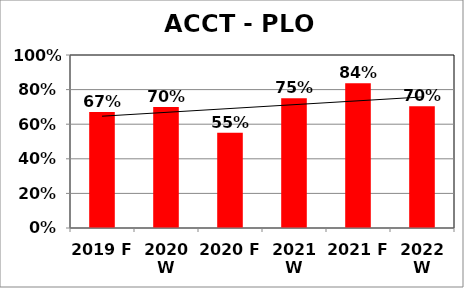
| Category | Series 0 |
|---|---|
| 2019 F | 0.67 |
| 2020 W | 0.7 |
| 2020 F | 0.55 |
| 2021 W | 0.75 |
| 2021 F | 0.837 |
| 2022 W | 0.704 |